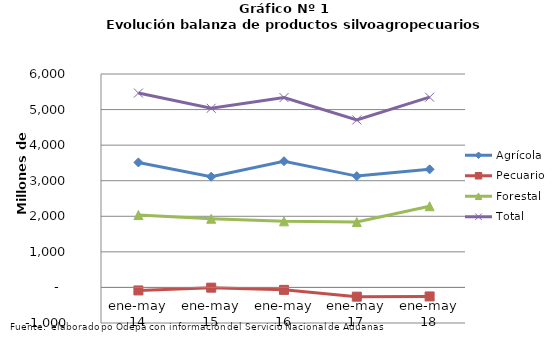
| Category | Agrícola | Pecuario | Forestal | Total |
|---|---|---|---|---|
| ene-may 14 | 3514357 | -84658 | 2033990 | 5463689 |
| ene-may 15 | 3112851 | -6820 | 1930982 | 5037013 |
| ene-may 16 | 3547209 | -68542 | 1858509 | 5337176 |
| ene-may 17 | 3129781 | -259773 | 1838353 | 4708361 |
| ene-may 18 | 3319498 | -253545 | 2282029 | 5347982 |